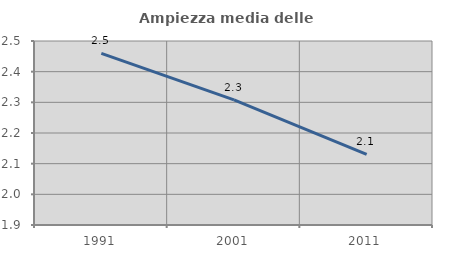
| Category | Ampiezza media delle famiglie |
|---|---|
| 1991.0 | 2.46 |
| 2001.0 | 2.308 |
| 2011.0 | 2.13 |